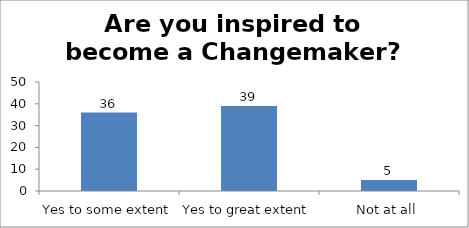
| Category | Are you inspired to become a Changemaker?   |
|---|---|
| Yes to some extent | 36 |
| Yes to great extent | 39 |
| Not at all | 5 |